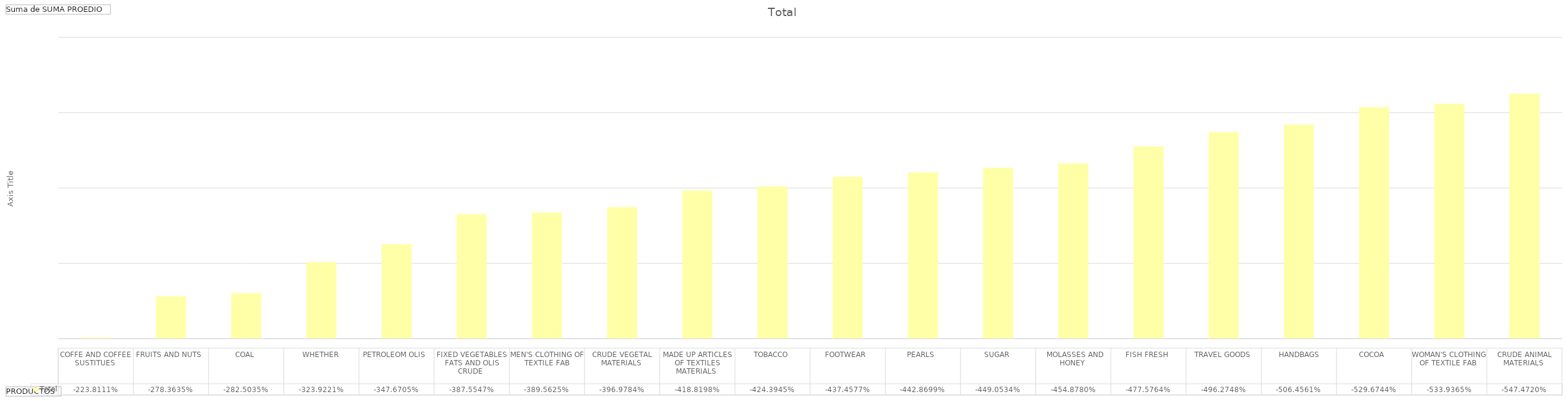
| Category | Total |
|---|---|
| COFFE AND COFFEE SUSTITUES  | 0.006 |
| FRUITS AND NUTS  | 0.002 |
| COAL, WHETHER  | 0.001 |
| PETROLEOM OLIS  | 0.001 |
| FIXED VEGETABLES FATS AND OLIS CRUDE  | 0 |
| MEN'S CLOTHING OF TEXTILE FAB | 0 |
| CRUDE VEGETAL MATERIALS  | 0 |
| MADE UP ARTICLES OF TEXTILES MATERIALS  | 0 |
| TOBACCO | 0 |
| FOOTWEAR  | 0 |
| PEARLS  | 0 |
| SUGAR, MOLASSES AND HONEY  | 0 |
| FISH FRESH  | 0 |
| TRAVEL GOODS, HANDBAGS | 0 |
| COCOA  | 0 |
| WOMAN'S CLOTHING OF TEXTILE FAB  | 0 |
| CRUDE ANIMAL MATERIALS  | 0 |
| FRUIT PRESERVED AND PREPARATION  | 0 |
| LEATHER  | 0 |
| COTTON  | 0 |